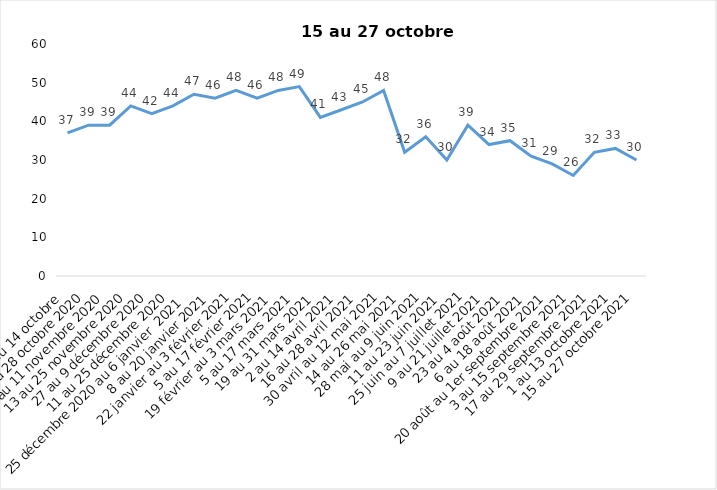
| Category | Toujours aux trois mesures |
|---|---|
| 2 au 14 octobre  | 37 |
| 16 au 28 octobre 2020 | 39 |
| 30 octobre au 11 novembre 2020 | 39 |
| 13 au 25 novembre 2020 | 44 |
| 27 au 9 décembre 2020 | 42 |
| 11 au 25 décembre 2020 | 44 |
| 25 décembre 2020 au 6 janvier  2021 | 47 |
| 8 au 20 janvier 2021 | 46 |
| 22 janvier au 3 février 2021 | 48 |
| 5 au 17 février 2021 | 46 |
| 19 février au 3 mars 2021 | 48 |
| 5 au 17 mars 2021 | 49 |
| 19 au 31 mars 2021 | 41 |
| 2 au 14 avril 2021 | 43 |
| 16 au 28 avril 2021 | 45 |
| 30 avril au 12 mai 2021 | 48 |
| 14 au 26 mai 2021 | 32 |
| 28 mai au 9 juin 2021 | 36 |
| 11 au 23 juin 2021 | 30 |
| 25 juin au 7 juillet 2021 | 39 |
| 9 au 21 juillet 2021 | 34 |
| 23 au 4 août 2021 | 35 |
| 6 au 18 août 2021 | 31 |
| 20 août au 1er septembre 2021 | 29 |
| 3 au 15 septembre 2021 | 26 |
| 17 au 29 septembre 2021 | 32 |
| 1 au 13 octobre 2021 | 33 |
| 15 au 27 octobre 2021 | 30 |